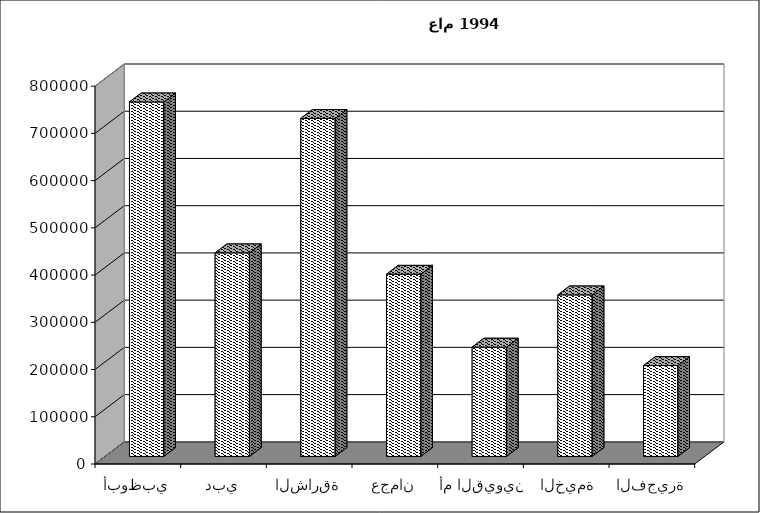
| Category | Series 0 |
|---|---|
| أبوظبي | 750615 |
| دبي | 431075 |
| الشارقة | 715712 |
| عجمان | 385761 |
| أم القيوين | 231480 |
| رأس الخيمة | 342058 |
| الفجيرة | 192440 |